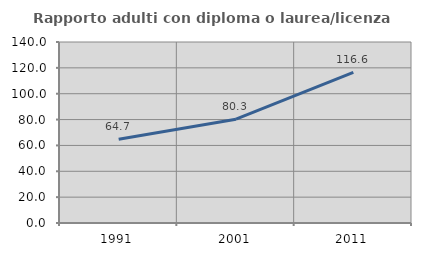
| Category | Rapporto adulti con diploma o laurea/licenza media  |
|---|---|
| 1991.0 | 64.732 |
| 2001.0 | 80.263 |
| 2011.0 | 116.558 |